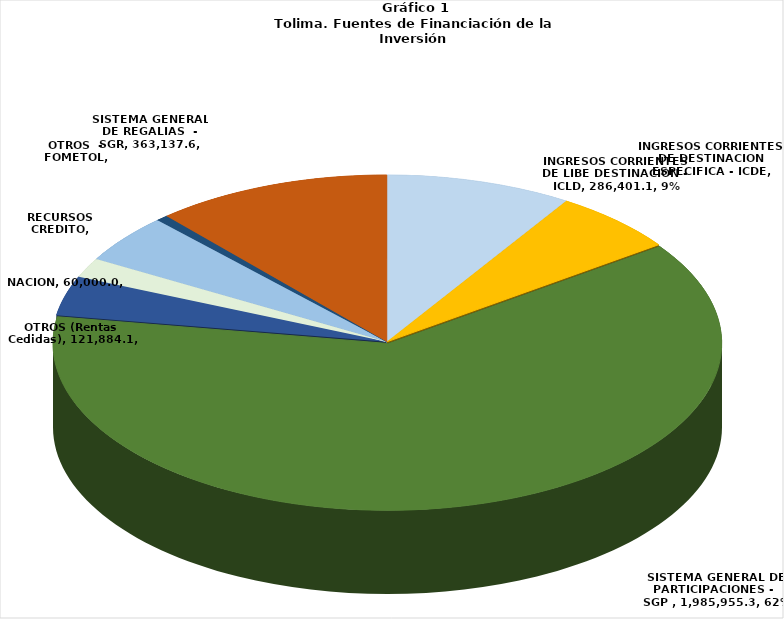
| Category | Series 0 | Series 1 | Series 2 |
|---|---|---|---|
| INGRESOS CORRIENTES DE LIBE DESTINACION -  ICLD |  | 286401.058 | 0.09 |
| INGRESOS CORRIENTES DE DESTINACION ESPECIFICA - ICDE |  | 193957.321 | 0.061 |
| SISTEMA GENERAL DE PARTICIPACIONES -  SGP  |  | 1985955.343 | 0.624 |
| OTROS (Rentas Cedidas) |  | 121884.082 | 0.038 |
| NACION |  | 60000 | 0.019 |
| RECURSOS CREDITO |  | 150000 | 0.047 |
| OTROS  - FOMETOL |  | 18738.511 | 0.006 |
| SISTEMA GENERAL DE REGALIAS  - SGR |  | 363137.6 | 0.114 |